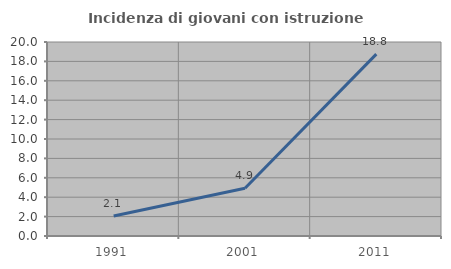
| Category | Incidenza di giovani con istruzione universitaria |
|---|---|
| 1991.0 | 2.062 |
| 2001.0 | 4.918 |
| 2011.0 | 18.75 |